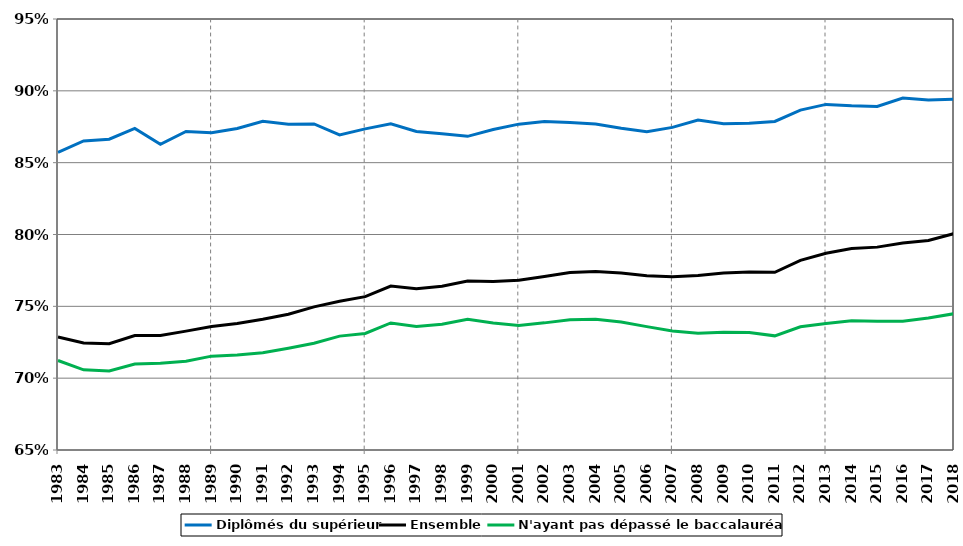
| Category | Diplômés du supérieur | Ensemble | N'ayant pas dépassé le baccalauréat* |
|---|---|---|---|
| 1983.0 | 0.857 | 0.729 | 0.712 |
| 1984.0 | 0.865 | 0.724 | 0.706 |
| 1985.0 | 0.866 | 0.724 | 0.705 |
| 1986.0 | 0.874 | 0.73 | 0.71 |
| 1987.0 | 0.863 | 0.73 | 0.71 |
| 1988.0 | 0.872 | 0.733 | 0.712 |
| 1989.0 | 0.871 | 0.736 | 0.715 |
| 1990.0 | 0.874 | 0.738 | 0.716 |
| 1991.0 | 0.879 | 0.741 | 0.718 |
| 1992.0 | 0.877 | 0.745 | 0.721 |
| 1993.0 | 0.877 | 0.75 | 0.724 |
| 1994.0 | 0.869 | 0.754 | 0.729 |
| 1995.0 | 0.874 | 0.757 | 0.731 |
| 1996.0 | 0.877 | 0.764 | 0.738 |
| 1997.0 | 0.872 | 0.762 | 0.736 |
| 1998.0 | 0.87 | 0.764 | 0.738 |
| 1999.0 | 0.868 | 0.768 | 0.741 |
| 2000.0 | 0.873 | 0.767 | 0.738 |
| 2001.0 | 0.877 | 0.768 | 0.737 |
| 2002.0 | 0.879 | 0.771 | 0.738 |
| 2003.0 | 0.878 | 0.774 | 0.741 |
| 2004.0 | 0.877 | 0.774 | 0.741 |
| 2005.0 | 0.874 | 0.773 | 0.739 |
| 2006.0 | 0.872 | 0.771 | 0.736 |
| 2007.0 | 0.875 | 0.771 | 0.733 |
| 2008.0 | 0.88 | 0.771 | 0.731 |
| 2009.0 | 0.877 | 0.773 | 0.732 |
| 2010.0 | 0.877 | 0.774 | 0.732 |
| 2011.0 | 0.879 | 0.774 | 0.729 |
| 2012.0 | 0.887 | 0.782 | 0.736 |
| 2013.0 | 0.891 | 0.787 | 0.738 |
| 2014.0 | 0.89 | 0.79 | 0.74 |
| 2015.0 | 0.889 | 0.791 | 0.74 |
| 2016.0 | 0.895 | 0.794 | 0.74 |
| 2017.0 | 0.894 | 0.796 | 0.742 |
| 2018.0 | 0.894 | 0.801 | 0.745 |